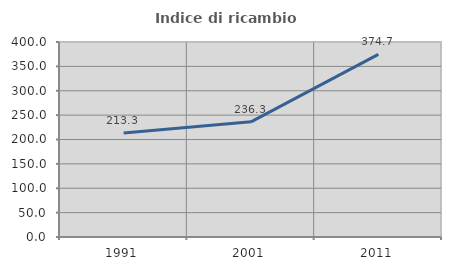
| Category | Indice di ricambio occupazionale  |
|---|---|
| 1991.0 | 213.278 |
| 2001.0 | 236.26 |
| 2011.0 | 374.661 |